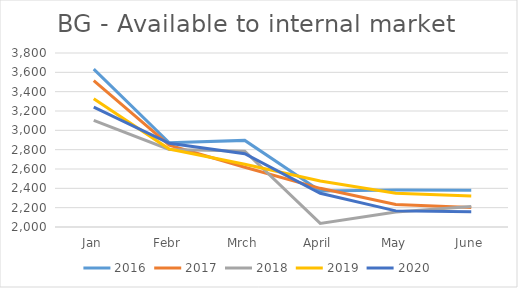
| Category | 2016 | 2017 | 2018 | 2019 | 2020 |
|---|---|---|---|---|---|
| Jan | 3633 | 3515 | 3103 | 3327 | 3241.1 |
| Febr | 2872 | 2847 | 2802 | 2806 | 2865.71 |
| Mrch | 2896 | 2618 | 2785 | 2649 | 2757.335 |
| April | 2373 | 2400 | 2037 | 2476 | 2349.46 |
| May | 2384 | 2232 | 2154 | 2350 | 2166.811 |
| June | 2381 | 2201 | 2211 | 2320 | 2159.043 |